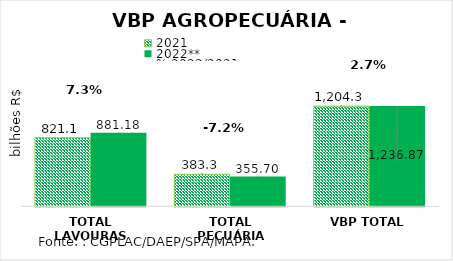
| Category | 2021 | 2022** |
|---|---|---|
| TOTAL LAVOURAS | 821.066 | 881.175 |
| TOTAL PECUÁRIA | 383.281 | 355.696 |
| VBP TOTAL | 1204.347 | 1236.872 |